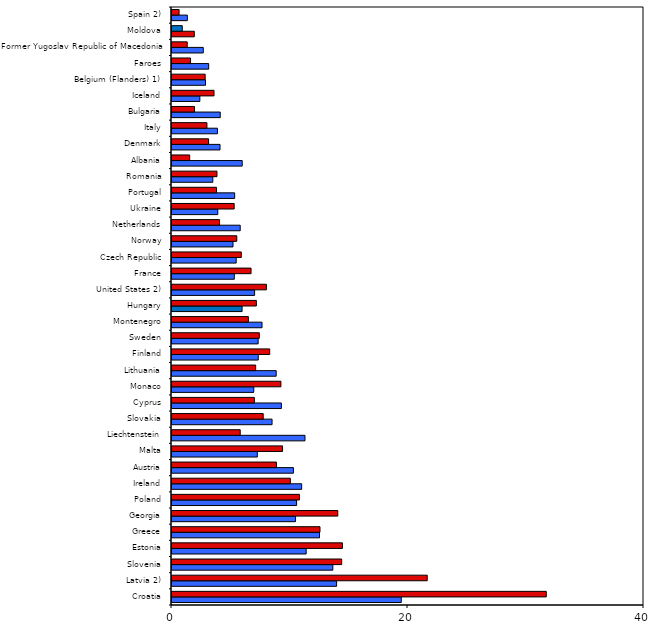
| Category | Boys | Girls |
|---|---|---|
| Croatia | 19.43 | 31.72 |
| Latvia 2) | 13.95 | 21.63 |
| Slovenia | 13.63 | 14.38 |
| Estonia | 11.37 | 14.44 |
| Greece | 12.5 | 12.54 |
| Georgia | 10.47 | 14.05 |
| Poland | 10.56 | 10.8 |
| Ireland | 10.99 | 10.03 |
| Austria | 10.29 | 8.85 |
| Malta | 7.23 | 9.37 |
| Liechtenstein | 11.27 | 5.78 |
| Slovakia | 8.48 | 7.73 |
| Cyprus | 9.27 | 6.98 |
| Monaco | 6.93 | 9.23 |
| Lithuania | 8.83 | 7.09 |
| Finland | 7.31 | 8.28 |
| Sweden | 7.3 | 7.4 |
| Montenegro | 7.63 | 6.47 |
| Hungary | 5.94 | 7.15 |
| United States 2) | 7 | 8 |
| France | 5.28 | 6.7 |
| Czech Republic | 5.44 | 5.87 |
| Norway | 5.17 | 5.49 |
| Netherlands | 5.78 | 4.03 |
| Ukraine | 3.88 | 5.27 |
| Portugal | 5.31 | 3.77 |
| Romania | 3.46 | 3.81 |
| Albania | 5.95 | 1.5 |
| Denmark | 4.07 | 3.1 |
| Italy | 3.85 | 2.96 |
| Bulgaria | 4.09 | 1.91 |
| Iceland | 2.36 | 3.56 |
| Belgium (Flanders) 1) | 2.84 | 2.81 |
| Faroes | 3.11 | 1.57 |
| Former Yugoslav Republic of Macedonia | 2.65 | 1.29 |
| Moldova | 1.89 | 0.87 |
| Spain 2) | 1.3 | 0.6 |